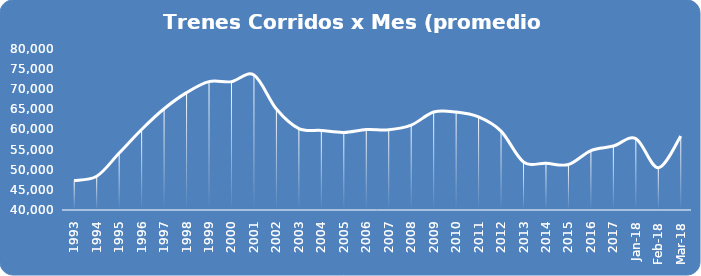
| Category | Series 0 |
|---|---|
| 1993.0 | 47344.667 |
| 1994.0 | 48375 |
| 1995.0 | 54141.667 |
| 1996.0 | 60006.5 |
| 1997.0 | 65151.083 |
| 1998.0 | 69168.25 |
| 1999.0 | 71890.333 |
| 2000.0 | 71885.417 |
| 2001.0 | 73530.667 |
| 2002.0 | 65076.167 |
| 2003.0 | 60220.083 |
| 2004.0 | 59758.083 |
| 2005.0 | 59257.083 |
| 2006.0 | 59994.083 |
| 2007.0 | 59947.667 |
| 2008.0 | 61081.083 |
| 2009.0 | 64336.917 |
| 2010.0 | 64321.917 |
| 2011.0 | 63128.917 |
| 2012.0 | 59598.583 |
| 2013.0 | 51948.667 |
| 2014.0 | 51618.583 |
| 2015.0 | 51310 |
| 2016.0 | 54764.75 |
| 2017.0 | 55883.333 |
| 43101.0 | 57735 |
| 43132.0 | 50490 |
| 43160.0 | 58344 |